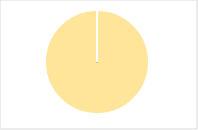
| Category | Total |
|---|---|
| Y | 0 |
| R | 0 |
| T | 0 |
| M | 0 |
| F | 0 |
| N | 87 |